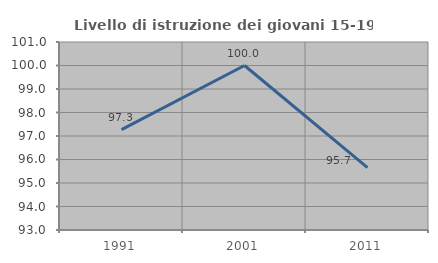
| Category | Livello di istruzione dei giovani 15-19 anni |
|---|---|
| 1991.0 | 97.273 |
| 2001.0 | 100 |
| 2011.0 | 95.652 |